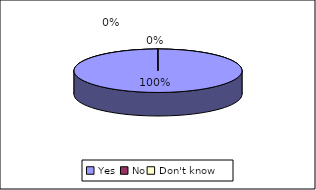
| Category | Did the nurse make you feel comfortable and at ease |
|---|---|
| Yes  | 9697 |
| No | 1 |
| Don't know  | 2 |